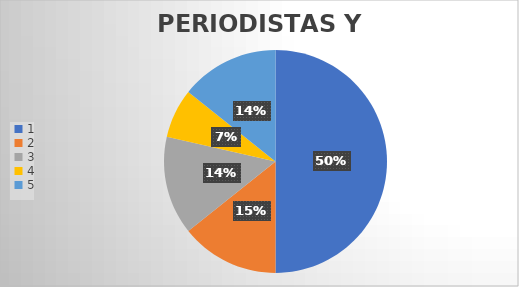
| Category | Series 0 |
|---|---|
| 0 | 7 |
| 1 | 2 |
| 2 | 2 |
| 3 | 1 |
| 4 | 2 |